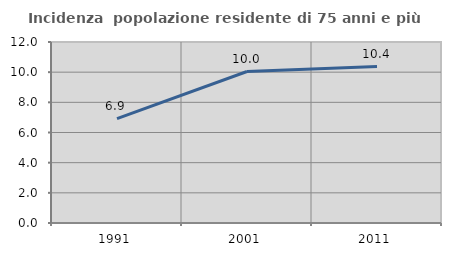
| Category | Incidenza  popolazione residente di 75 anni e più |
|---|---|
| 1991.0 | 6.916 |
| 2001.0 | 10.043 |
| 2011.0 | 10.372 |